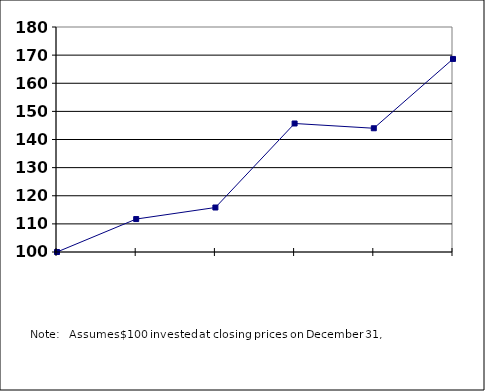
| Category | Series 0 |
|---|---|
| nan | 100 |
| 2017.0 | 111.716 |
| 2018.0 | 115.821 |
| 2019.0 | 145.69 |
| 2020.0 | 143.995 |
| 2021.0 | 168.644 |